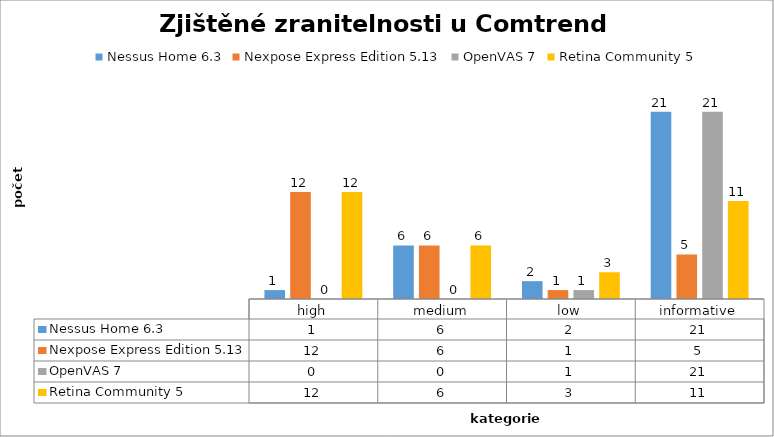
| Category | Nessus Home 6.3 | Nexpose Express Edition 5.13 | OpenVAS 7 | Retina Community 5 |
|---|---|---|---|---|
| high | 1 | 12 | 0 | 12 |
| medium | 6 | 6 | 0 | 6 |
| low | 2 | 1 | 1 | 3 |
| informative | 21 | 5 | 21 | 11 |